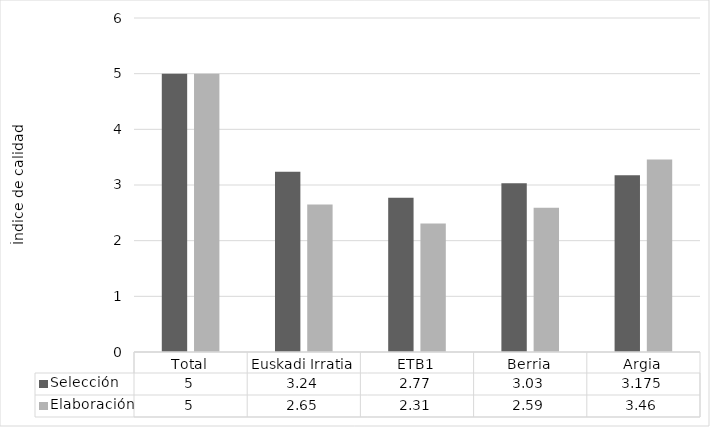
| Category | Selección | Elaboración |
|---|---|---|
| Total | 5 | 5 |
| Euskadi Irratia | 3.24 | 2.65 |
| ETB1 | 2.77 | 2.31 |
| Berria | 3.03 | 2.59 |
| Argia | 3.175 | 3.46 |